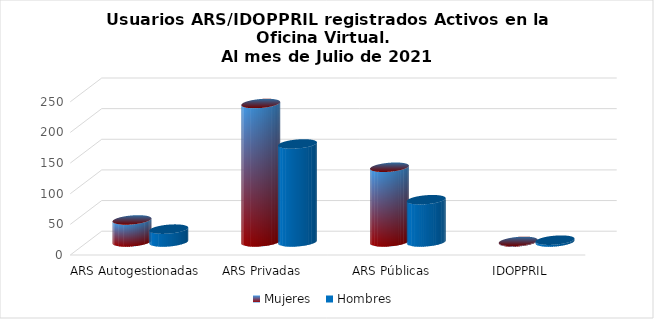
| Category | Mujeres | Hombres |
|---|---|---|
| ARS Autogestionadas | 36 | 21 |
| ARS Privadas | 226 | 160 |
| ARS Públicas | 122 | 69 |
| IDOPPRIL | 1 | 3 |